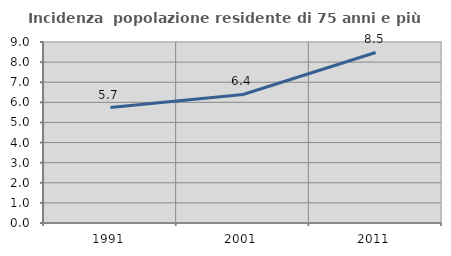
| Category | Incidenza  popolazione residente di 75 anni e più |
|---|---|
| 1991.0 | 5.74 |
| 2001.0 | 6.391 |
| 2011.0 | 8.48 |